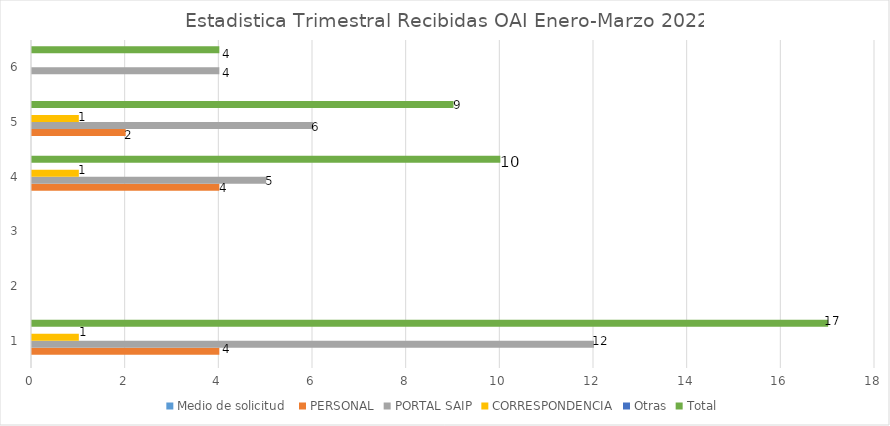
| Category | Medio de solicitud  | PERSONAL | PORTAL SAIP | CORRESPONDENCIA | Otras | Total |
|---|---|---|---|---|---|---|
| 0 | 0 | 4 | 12 | 1 | 0 | 17 |
| 1 | 0 | 0 | 0 | 0 | 0 | 0 |
| 2 | 0 | 0 | 0 | 0 | 0 | 0 |
| 3 | 0 | 4 | 5 | 1 | 0 | 10 |
| 4 | 0 | 2 | 6 | 1 | 0 | 9 |
| 5 | 0 | 0 | 4 | 0 | 0 | 4 |